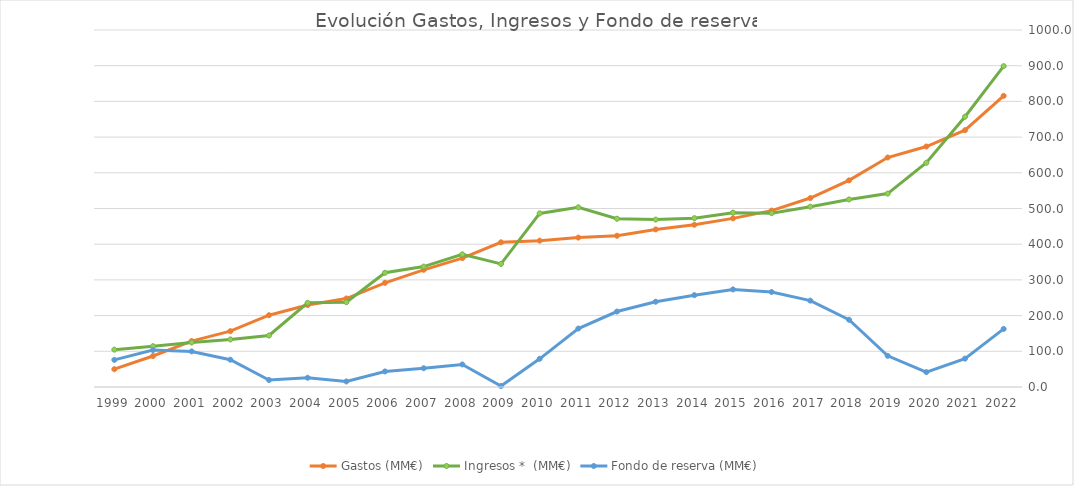
| Category | Gastos (MM€) | Ingresos *  (MM€) | Fondo de reserva (MM€) |
|---|---|---|---|
| 1999.0 | 49.846 | 104.658 | 76.048 |
| 2000.0 | 86.784 | 114.262 | 103.526 |
| 2001.0 | 128.635 | 124.755 | 99.646 |
| 2002.0 | 156.344 | 133.171 | 76.473 |
| 2003.0 | 201.092 | 144.215 | 19.596 |
| 2004.0 | 229.524 | 235.781 | 25.853 |
| 2005.0 | 247.84 | 237.499 | 15.512 |
| 2006.0 | 291.833 | 319.905 | 43.584 |
| 2007.0 | 328.246 | 337.241 | 52.579 |
| 2008.0 | 360.899 | 371.54 | 63.214 |
| 2009.0 | 405.307 | 344.765 | 2.678 |
| 2010.0 | 409.925 | 486.207 | 78.96 |
| 2011.0 | 418.527 | 503.286 | 163.719 |
| 2012.0 | 423.658 | 471.347 | 211.408 |
| 2013.0 | 441.382 | 468.892 | 238.918 |
| 2014.0 | 454.416 | 472.847 | 257.265 |
| 2015.0 | 472.382 | 488.353 | 273.32 |
| 2016.0 | 494.112 | 486.804 | 266.012 |
| 2017.0 | 529.281 | 505.181 | 241.912 |
| 2018.0 | 578.81 | 525.262 | 188.364 |
| 2019.0 | 642.812 | 541.732 | 87.284 |
| 2020.0 | 673.599 | 628.026 | 41.711 |
| 2021.0 | 719.33 | 757.106 | 79.487 |
| 2022.0 | 815.535 | 898.733 | 162.718 |